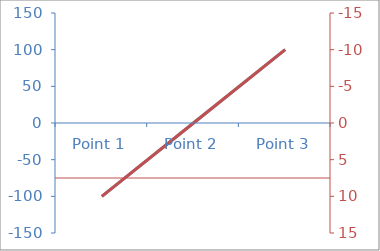
| Category | Series 1 |
|---|---|
| Point 1 | -100 |
| Point 2 | 0 |
| Point 3 | 100 |